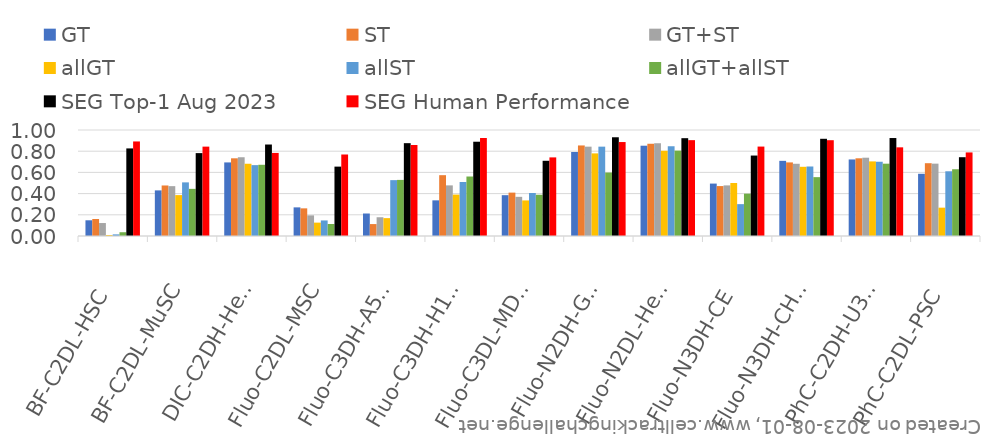
| Category | GT | ST | GT+ST | allGT | allST | allGT+allST | SEG Top-1 Aug 2023 | SEG Human Performance |
|---|---|---|---|---|---|---|---|---|
| BF-C2DL-HSC | 0.148 | 0.16 | 0.122 | 0.01 | 0.015 | 0.036 | 0.826 | 0.892 |
| BF-C2DL-MuSC | 0.43 | 0.477 | 0.47 | 0.386 | 0.506 | 0.445 | 0.782 | 0.843 |
| DIC-C2DH-HeLa | 0.694 | 0.733 | 0.743 | 0.682 | 0.669 | 0.672 | 0.863 | 0.784 |
| Fluo-C2DL-MSC | 0.27 | 0.261 | 0.195 | 0.126 | 0.147 | 0.113 | 0.655 | 0.769 |
| Fluo-C3DH-A549 | 0.212 | 0.113 | 0.177 | 0.169 | 0.527 | 0.529 | 0.876 | 0.859 |
| Fluo-C3DH-H157 | 0.336 | 0.574 | 0.478 | 0.391 | 0.51 | 0.561 | 0.889 | 0.924 |
| Fluo-C3DL-MDA231 | 0.385 | 0.409 | 0.37 | 0.336 | 0.406 | 0.389 | 0.71 | 0.742 |
| Fluo-N2DH-GOWT1 | 0.793 | 0.854 | 0.843 | 0.779 | 0.843 | 0.599 | 0.931 | 0.886 |
| Fluo-N2DL-HeLa | 0.852 | 0.87 | 0.875 | 0.804 | 0.847 | 0.805 | 0.923 | 0.904 |
| Fluo-N3DH-CE | 0.495 | 0.471 | 0.477 | 0.5 | 0.301 | 0.399 | 0.759 | 0.844 |
| Fluo-N3DH-CHO | 0.709 | 0.694 | 0.681 | 0.653 | 0.656 | 0.555 | 0.917 | 0.904 |
| PhC-C2DH-U373 | 0.722 | 0.733 | 0.739 | 0.704 | 0.701 | 0.682 | 0.924 | 0.836 |
| PhC-C2DL-PSC | 0.587 | 0.687 | 0.683 | 0.267 | 0.611 | 0.63 | 0.743 | 0.788 |